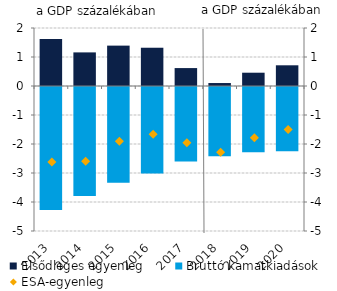
| Category | Elsődleges egyenleg | Bruttó kamatkiadások |
|---|---|---|
| 2013.0 | 1.618 | -4.238 |
| 2014.0 | 1.159 | -3.758 |
| 2015.0 | 1.392 | -3.298 |
| 2016.0 | 1.319 | -2.984 |
| 2017.0 | 0.618 | -2.573 |
| 2018.0 | 0.102 | -2.388 |
| 2019.0 | 0.458 | -2.247 |
| 2020.0 | 0.714 | -2.214 |